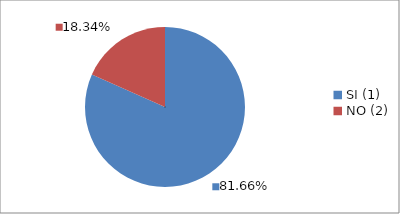
| Category | Series 0 |
|---|---|
| SI (1) | 0.817 |
| NO (2) | 0.183 |